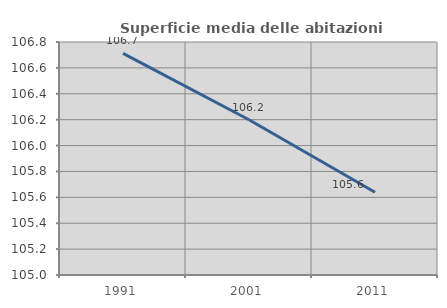
| Category | Superficie media delle abitazioni occupate |
|---|---|
| 1991.0 | 106.712 |
| 2001.0 | 106.199 |
| 2011.0 | 105.639 |